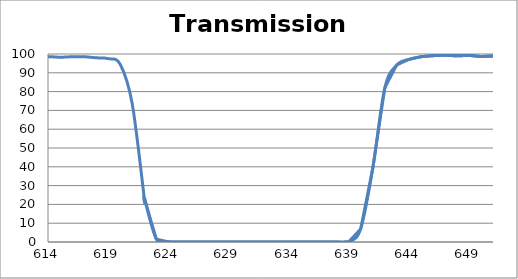
| Category | Transmission (%) |
|---|---|
| 2600.0 | 53.779 |
| 2599.0 | 53.903 |
| 2598.0 | 54.052 |
| 2597.0 | 54.214 |
| 2596.0 | 54.414 |
| 2595.0 | 54.621 |
| 2594.0 | 54.857 |
| 2593.0 | 55.113 |
| 2592.0 | 55.359 |
| 2591.0 | 55.598 |
| 2590.0 | 55.882 |
| 2589.0 | 56.105 |
| 2588.0 | 56.334 |
| 2587.0 | 56.587 |
| 2586.0 | 56.781 |
| 2585.0 | 56.951 |
| 2584.0 | 57.14 |
| 2583.0 | 57.288 |
| 2582.0 | 57.428 |
| 2581.0 | 57.559 |
| 2580.0 | 57.666 |
| 2579.0 | 57.759 |
| 2578.0 | 57.861 |
| 2577.0 | 57.938 |
| 2576.0 | 57.97 |
| 2575.0 | 58.003 |
| 2574.0 | 58.03 |
| 2573.0 | 58.017 |
| 2572.0 | 57.987 |
| 2571.0 | 57.946 |
| 2570.0 | 57.883 |
| 2569.0 | 57.814 |
| 2568.0 | 57.769 |
| 2567.0 | 57.751 |
| 2566.0 | 57.688 |
| 2565.0 | 57.665 |
| 2564.0 | 57.629 |
| 2563.0 | 57.592 |
| 2562.0 | 57.558 |
| 2561.0 | 57.552 |
| 2560.0 | 57.543 |
| 2559.0 | 57.553 |
| 2558.0 | 57.589 |
| 2557.0 | 57.664 |
| 2556.0 | 57.778 |
| 2555.0 | 57.915 |
| 2554.0 | 58.063 |
| 2553.0 | 58.225 |
| 2552.0 | 58.458 |
| 2551.0 | 58.707 |
| 2550.0 | 59.029 |
| 2549.0 | 59.419 |
| 2548.0 | 59.842 |
| 2547.0 | 60.257 |
| 2546.0 | 60.72 |
| 2545.0 | 61.197 |
| 2544.0 | 61.707 |
| 2543.0 | 62.208 |
| 2542.0 | 62.696 |
| 2541.0 | 63.156 |
| 2540.0 | 63.658 |
| 2539.0 | 64.196 |
| 2538.0 | 64.724 |
| 2537.0 | 65.247 |
| 2536.0 | 65.795 |
| 2535.0 | 66.284 |
| 2534.0 | 66.806 |
| 2533.0 | 67.324 |
| 2532.0 | 67.748 |
| 2531.0 | 68.104 |
| 2530.0 | 68.475 |
| 2529.0 | 68.784 |
| 2528.0 | 69.013 |
| 2527.0 | 69.186 |
| 2526.0 | 69.29 |
| 2525.0 | 69.328 |
| 2524.0 | 69.316 |
| 2523.0 | 69.221 |
| 2522.0 | 69.059 |
| 2521.0 | 68.856 |
| 2520.0 | 68.588 |
| 2519.0 | 68.261 |
| 2518.0 | 67.891 |
| 2517.0 | 67.444 |
| 2516.0 | 66.932 |
| 2515.0 | 66.382 |
| 2514.0 | 65.857 |
| 2513.0 | 65.319 |
| 2512.0 | 64.758 |
| 2511.0 | 64.233 |
| 2510.0 | 63.623 |
| 2509.0 | 63.084 |
| 2508.0 | 62.562 |
| 2507.0 | 62.037 |
| 2506.0 | 61.54 |
| 2505.0 | 61.094 |
| 2504.0 | 60.698 |
| 2503.0 | 60.313 |
| 2502.0 | 59.962 |
| 2501.0 | 59.698 |
| 2500.0 | 59.497 |
| 2499.0 | 59.322 |
| 2498.0 | 59.209 |
| 2497.0 | 59.177 |
| 2496.0 | 59.19 |
| 2495.0 | 59.253 |
| 2494.0 | 59.372 |
| 2493.0 | 59.544 |
| 2492.0 | 59.79 |
| 2491.0 | 60.092 |
| 2490.0 | 60.452 |
| 2489.0 | 60.864 |
| 2488.0 | 61.324 |
| 2487.0 | 61.822 |
| 2486.0 | 62.352 |
| 2485.0 | 62.927 |
| 2484.0 | 63.575 |
| 2483.0 | 64.228 |
| 2482.0 | 64.945 |
| 2481.0 | 65.644 |
| 2480.0 | 66.351 |
| 2479.0 | 67.07 |
| 2478.0 | 67.779 |
| 2477.0 | 68.444 |
| 2476.0 | 69.126 |
| 2475.0 | 69.756 |
| 2474.0 | 70.365 |
| 2473.0 | 70.929 |
| 2472.0 | 71.455 |
| 2471.0 | 71.878 |
| 2470.0 | 72.217 |
| 2469.0 | 72.469 |
| 2468.0 | 72.666 |
| 2467.0 | 72.79 |
| 2466.0 | 72.822 |
| 2465.0 | 72.741 |
| 2464.0 | 72.591 |
| 2463.0 | 72.411 |
| 2462.0 | 72.176 |
| 2461.0 | 71.874 |
| 2460.0 | 71.514 |
| 2459.0 | 71.107 |
| 2458.0 | 70.675 |
| 2457.0 | 70.243 |
| 2456.0 | 69.792 |
| 2455.0 | 69.34 |
| 2454.0 | 68.873 |
| 2453.0 | 68.418 |
| 2452.0 | 67.992 |
| 2451.0 | 67.603 |
| 2450.0 | 67.24 |
| 2449.0 | 66.889 |
| 2448.0 | 66.58 |
| 2447.0 | 66.326 |
| 2446.0 | 66.14 |
| 2445.0 | 66.019 |
| 2444.0 | 65.929 |
| 2443.0 | 65.893 |
| 2442.0 | 65.915 |
| 2441.0 | 66.005 |
| 2440.0 | 66.152 |
| 2439.0 | 66.37 |
| 2438.0 | 66.647 |
| 2437.0 | 66.967 |
| 2436.0 | 67.336 |
| 2435.0 | 67.747 |
| 2434.0 | 68.198 |
| 2433.0 | 68.706 |
| 2432.0 | 69.241 |
| 2431.0 | 69.799 |
| 2430.0 | 70.383 |
| 2429.0 | 70.961 |
| 2428.0 | 71.532 |
| 2427.0 | 72.08 |
| 2426.0 | 72.606 |
| 2425.0 | 73.115 |
| 2424.0 | 73.588 |
| 2423.0 | 73.996 |
| 2422.0 | 74.333 |
| 2421.0 | 74.624 |
| 2420.0 | 74.871 |
| 2419.0 | 75.024 |
| 2418.0 | 75.088 |
| 2417.0 | 75.087 |
| 2416.0 | 75.011 |
| 2415.0 | 74.825 |
| 2414.0 | 74.555 |
| 2413.0 | 74.255 |
| 2412.0 | 73.935 |
| 2411.0 | 73.557 |
| 2410.0 | 73.111 |
| 2409.0 | 72.607 |
| 2408.0 | 72.076 |
| 2407.0 | 71.545 |
| 2406.0 | 71.018 |
| 2405.0 | 70.482 |
| 2404.0 | 69.941 |
| 2403.0 | 69.397 |
| 2402.0 | 68.863 |
| 2401.0 | 68.35 |
| 2400.0 | 67.883 |
| 2399.0 | 67.492 |
| 2398.0 | 67.153 |
| 2397.0 | 66.83 |
| 2396.0 | 66.538 |
| 2395.0 | 66.303 |
| 2394.0 | 66.12 |
| 2393.0 | 66.016 |
| 2392.0 | 65.989 |
| 2391.0 | 65.994 |
| 2390.0 | 66.034 |
| 2389.0 | 66.123 |
| 2388.0 | 66.263 |
| 2387.0 | 66.424 |
| 2386.0 | 66.601 |
| 2385.0 | 66.823 |
| 2384.0 | 67.102 |
| 2383.0 | 67.369 |
| 2382.0 | 67.601 |
| 2381.0 | 67.823 |
| 2380.0 | 68.039 |
| 2379.0 | 68.228 |
| 2378.0 | 68.398 |
| 2377.0 | 68.518 |
| 2376.0 | 68.587 |
| 2375.0 | 68.603 |
| 2374.0 | 68.546 |
| 2373.0 | 68.41 |
| 2372.0 | 68.222 |
| 2371.0 | 67.959 |
| 2370.0 | 67.607 |
| 2369.0 | 67.178 |
| 2368.0 | 66.701 |
| 2367.0 | 66.154 |
| 2366.0 | 65.565 |
| 2365.0 | 64.919 |
| 2364.0 | 64.226 |
| 2363.0 | 63.482 |
| 2362.0 | 62.712 |
| 2361.0 | 61.966 |
| 2360.0 | 61.207 |
| 2359.0 | 60.414 |
| 2358.0 | 59.668 |
| 2357.0 | 58.926 |
| 2356.0 | 58.195 |
| 2355.0 | 57.501 |
| 2354.0 | 56.883 |
| 2353.0 | 56.35 |
| 2352.0 | 55.861 |
| 2351.0 | 55.414 |
| 2350.0 | 55.034 |
| 2349.0 | 54.702 |
| 2348.0 | 54.452 |
| 2347.0 | 54.303 |
| 2346.0 | 54.239 |
| 2345.0 | 54.245 |
| 2344.0 | 54.319 |
| 2343.0 | 54.458 |
| 2342.0 | 54.673 |
| 2341.0 | 54.961 |
| 2340.0 | 55.332 |
| 2339.0 | 55.827 |
| 2338.0 | 56.362 |
| 2337.0 | 56.941 |
| 2336.0 | 57.569 |
| 2335.0 | 58.253 |
| 2334.0 | 58.982 |
| 2333.0 | 59.748 |
| 2332.0 | 60.547 |
| 2331.0 | 61.399 |
| 2330.0 | 62.28 |
| 2329.0 | 63.113 |
| 2328.0 | 63.949 |
| 2327.0 | 64.811 |
| 2326.0 | 65.656 |
| 2325.0 | 66.45 |
| 2324.0 | 67.157 |
| 2323.0 | 67.799 |
| 2322.0 | 68.369 |
| 2321.0 | 68.88 |
| 2320.0 | 69.277 |
| 2319.0 | 69.567 |
| 2318.0 | 69.756 |
| 2317.0 | 69.831 |
| 2316.0 | 69.797 |
| 2315.0 | 69.637 |
| 2314.0 | 69.424 |
| 2313.0 | 69.111 |
| 2312.0 | 68.73 |
| 2311.0 | 68.252 |
| 2310.0 | 67.715 |
| 2309.0 | 67.132 |
| 2308.0 | 66.515 |
| 2307.0 | 65.929 |
| 2306.0 | 65.367 |
| 2305.0 | 64.755 |
| 2304.0 | 64.186 |
| 2303.0 | 63.603 |
| 2302.0 | 63.074 |
| 2301.0 | 62.592 |
| 2300.0 | 62.181 |
| 2299.0 | 61.85 |
| 2298.0 | 61.554 |
| 2297.0 | 61.29 |
| 2296.0 | 61.102 |
| 2295.0 | 60.965 |
| 2294.0 | 60.884 |
| 2293.0 | 60.881 |
| 2292.0 | 60.959 |
| 2291.0 | 61.083 |
| 2290.0 | 61.239 |
| 2289.0 | 61.431 |
| 2288.0 | 61.688 |
| 2287.0 | 61.998 |
| 2286.0 | 62.347 |
| 2285.0 | 62.746 |
| 2284.0 | 63.17 |
| 2283.0 | 63.639 |
| 2282.0 | 64.169 |
| 2281.0 | 64.668 |
| 2280.0 | 65.184 |
| 2279.0 | 65.735 |
| 2278.0 | 66.275 |
| 2277.0 | 66.809 |
| 2276.0 | 67.317 |
| 2275.0 | 67.803 |
| 2274.0 | 68.307 |
| 2273.0 | 68.812 |
| 2272.0 | 69.269 |
| 2271.0 | 69.731 |
| 2270.0 | 70.165 |
| 2269.0 | 70.517 |
| 2268.0 | 70.858 |
| 2267.0 | 71.193 |
| 2266.0 | 71.53 |
| 2265.0 | 71.815 |
| 2264.0 | 72.085 |
| 2263.0 | 72.376 |
| 2262.0 | 72.617 |
| 2261.0 | 72.848 |
| 2260.0 | 73.064 |
| 2259.0 | 73.327 |
| 2258.0 | 73.552 |
| 2257.0 | 73.778 |
| 2256.0 | 73.924 |
| 2255.0 | 74.103 |
| 2254.0 | 74.264 |
| 2253.0 | 74.41 |
| 2252.0 | 74.517 |
| 2251.0 | 74.613 |
| 2250.0 | 74.645 |
| 2249.0 | 74.637 |
| 2248.0 | 74.606 |
| 2247.0 | 74.519 |
| 2246.0 | 74.387 |
| 2245.0 | 74.145 |
| 2244.0 | 73.804 |
| 2243.0 | 73.396 |
| 2242.0 | 72.939 |
| 2241.0 | 72.384 |
| 2240.0 | 71.725 |
| 2239.0 | 71.041 |
| 2238.0 | 70.295 |
| 2237.0 | 69.408 |
| 2236.0 | 68.477 |
| 2235.0 | 67.501 |
| 2234.0 | 66.505 |
| 2233.0 | 65.515 |
| 2232.0 | 64.478 |
| 2231.0 | 63.483 |
| 2230.0 | 62.499 |
| 2229.0 | 61.499 |
| 2228.0 | 60.526 |
| 2227.0 | 59.609 |
| 2226.0 | 58.749 |
| 2225.0 | 57.929 |
| 2224.0 | 57.2 |
| 2223.0 | 56.515 |
| 2222.0 | 55.949 |
| 2221.0 | 55.476 |
| 2220.0 | 55.108 |
| 2219.0 | 54.839 |
| 2218.0 | 54.677 |
| 2217.0 | 54.577 |
| 2216.0 | 54.631 |
| 2215.0 | 54.776 |
| 2214.0 | 55.015 |
| 2213.0 | 55.384 |
| 2212.0 | 55.908 |
| 2211.0 | 56.572 |
| 2210.0 | 57.324 |
| 2209.0 | 58.242 |
| 2208.0 | 59.349 |
| 2207.0 | 60.506 |
| 2206.0 | 61.762 |
| 2205.0 | 63.123 |
| 2204.0 | 64.642 |
| 2203.0 | 66.157 |
| 2202.0 | 67.722 |
| 2201.0 | 69.388 |
| 2200.0 | 71.001 |
| 2199.0 | 72.46 |
| 2198.0 | 73.881 |
| 2197.0 | 75.276 |
| 2196.0 | 76.391 |
| 2195.0 | 77.373 |
| 2194.0 | 78.067 |
| 2193.0 | 78.631 |
| 2192.0 | 78.917 |
| 2191.0 | 79.018 |
| 2190.0 | 78.958 |
| 2189.0 | 78.686 |
| 2188.0 | 78.246 |
| 2187.0 | 77.692 |
| 2186.0 | 77.04 |
| 2185.0 | 76.318 |
| 2184.0 | 75.559 |
| 2183.0 | 74.769 |
| 2182.0 | 73.998 |
| 2181.0 | 73.301 |
| 2180.0 | 72.62 |
| 2179.0 | 71.978 |
| 2178.0 | 71.479 |
| 2177.0 | 71.03 |
| 2176.0 | 70.688 |
| 2175.0 | 70.489 |
| 2174.0 | 70.367 |
| 2173.0 | 70.364 |
| 2172.0 | 70.455 |
| 2171.0 | 70.669 |
| 2170.0 | 71.026 |
| 2169.0 | 71.475 |
| 2168.0 | 72.034 |
| 2167.0 | 72.694 |
| 2166.0 | 73.429 |
| 2165.0 | 74.294 |
| 2164.0 | 75.242 |
| 2163.0 | 76.199 |
| 2162.0 | 77.184 |
| 2161.0 | 78.183 |
| 2160.0 | 79.237 |
| 2159.0 | 80.264 |
| 2158.0 | 81.277 |
| 2157.0 | 82.141 |
| 2156.0 | 82.898 |
| 2155.0 | 83.564 |
| 2154.0 | 84.113 |
| 2153.0 | 84.44 |
| 2152.0 | 84.646 |
| 2151.0 | 84.686 |
| 2150.0 | 84.583 |
| 2149.0 | 84.316 |
| 2148.0 | 83.905 |
| 2147.0 | 83.347 |
| 2146.0 | 82.72 |
| 2145.0 | 82.006 |
| 2144.0 | 81.266 |
| 2143.0 | 80.437 |
| 2142.0 | 79.6 |
| 2141.0 | 78.777 |
| 2140.0 | 78.029 |
| 2139.0 | 77.325 |
| 2138.0 | 76.695 |
| 2137.0 | 76.1 |
| 2136.0 | 75.625 |
| 2135.0 | 75.246 |
| 2134.0 | 74.94 |
| 2133.0 | 74.735 |
| 2132.0 | 74.674 |
| 2131.0 | 74.696 |
| 2130.0 | 74.821 |
| 2129.0 | 75.016 |
| 2128.0 | 75.284 |
| 2127.0 | 75.669 |
| 2126.0 | 76.111 |
| 2125.0 | 76.645 |
| 2124.0 | 77.205 |
| 2123.0 | 77.823 |
| 2122.0 | 78.471 |
| 2121.0 | 79.088 |
| 2120.0 | 79.701 |
| 2119.0 | 80.296 |
| 2118.0 | 80.836 |
| 2117.0 | 81.263 |
| 2116.0 | 81.584 |
| 2115.0 | 81.827 |
| 2114.0 | 81.989 |
| 2113.0 | 82.036 |
| 2112.0 | 81.945 |
| 2111.0 | 81.721 |
| 2110.0 | 81.41 |
| 2109.0 | 80.978 |
| 2108.0 | 80.457 |
| 2107.0 | 79.862 |
| 2106.0 | 79.262 |
| 2105.0 | 78.611 |
| 2104.0 | 77.974 |
| 2103.0 | 77.278 |
| 2102.0 | 76.615 |
| 2101.0 | 76.005 |
| 2100.0 | 75.472 |
| 2099.0 | 75.01 |
| 2098.0 | 74.594 |
| 2097.0 | 74.224 |
| 2096.0 | 73.982 |
| 2095.0 | 73.811 |
| 2094.0 | 73.737 |
| 2093.0 | 73.761 |
| 2092.0 | 73.868 |
| 2091.0 | 74.059 |
| 2090.0 | 74.299 |
| 2089.0 | 74.636 |
| 2088.0 | 75.049 |
| 2087.0 | 75.54 |
| 2086.0 | 76.104 |
| 2085.0 | 76.736 |
| 2084.0 | 77.332 |
| 2083.0 | 77.981 |
| 2082.0 | 78.618 |
| 2081.0 | 79.301 |
| 2080.0 | 79.981 |
| 2079.0 | 80.589 |
| 2078.0 | 81.157 |
| 2077.0 | 81.683 |
| 2076.0 | 82.155 |
| 2075.0 | 82.583 |
| 2074.0 | 82.919 |
| 2073.0 | 83.195 |
| 2072.0 | 83.401 |
| 2071.0 | 83.512 |
| 2070.0 | 83.588 |
| 2069.0 | 83.634 |
| 2068.0 | 83.627 |
| 2067.0 | 83.603 |
| 2066.0 | 83.567 |
| 2065.0 | 83.517 |
| 2064.0 | 83.498 |
| 2063.0 | 83.466 |
| 2062.0 | 83.451 |
| 2061.0 | 83.492 |
| 2060.0 | 83.58 |
| 2059.0 | 83.693 |
| 2058.0 | 83.815 |
| 2057.0 | 83.979 |
| 2056.0 | 84.188 |
| 2055.0 | 84.432 |
| 2054.0 | 84.738 |
| 2053.0 | 85.067 |
| 2052.0 | 85.36 |
| 2051.0 | 85.656 |
| 2050.0 | 85.947 |
| 2049.0 | 86.264 |
| 2048.0 | 86.564 |
| 2047.0 | 86.819 |
| 2046.0 | 87.054 |
| 2045.0 | 87.23 |
| 2044.0 | 87.353 |
| 2043.0 | 87.445 |
| 2042.0 | 87.489 |
| 2041.0 | 87.48 |
| 2040.0 | 87.407 |
| 2039.0 | 87.268 |
| 2038.0 | 87.104 |
| 2037.0 | 86.917 |
| 2036.0 | 86.701 |
| 2035.0 | 86.491 |
| 2034.0 | 86.285 |
| 2033.0 | 86.064 |
| 2032.0 | 85.851 |
| 2031.0 | 85.689 |
| 2030.0 | 85.571 |
| 2029.0 | 85.478 |
| 2028.0 | 85.417 |
| 2027.0 | 85.403 |
| 2026.0 | 85.433 |
| 2025.0 | 85.473 |
| 2024.0 | 85.559 |
| 2023.0 | 85.672 |
| 2022.0 | 85.783 |
| 2021.0 | 85.928 |
| 2020.0 | 86.052 |
| 2019.0 | 86.126 |
| 2018.0 | 86.186 |
| 2017.0 | 86.201 |
| 2016.0 | 86.176 |
| 2015.0 | 86.112 |
| 2014.0 | 85.997 |
| 2013.0 | 85.793 |
| 2012.0 | 85.487 |
| 2011.0 | 85.153 |
| 2010.0 | 84.772 |
| 2009.0 | 84.323 |
| 2008.0 | 83.812 |
| 2007.0 | 83.263 |
| 2006.0 | 82.674 |
| 2005.0 | 82.103 |
| 2004.0 | 81.55 |
| 2003.0 | 81.001 |
| 2002.0 | 80.489 |
| 2001.0 | 80.027 |
| 2000.0 | 79.619 |
| 1999.0 | 79.296 |
| 1998.0 | 79.064 |
| 1997.0 | 78.931 |
| 1996.0 | 78.887 |
| 1995.0 | 78.944 |
| 1994.0 | 79.126 |
| 1993.0 | 79.405 |
| 1992.0 | 79.815 |
| 1991.0 | 80.286 |
| 1990.0 | 80.845 |
| 1989.0 | 81.488 |
| 1988.0 | 82.16 |
| 1987.0 | 82.855 |
| 1986.0 | 83.578 |
| 1985.0 | 84.297 |
| 1984.0 | 84.993 |
| 1983.0 | 85.616 |
| 1982.0 | 86.152 |
| 1981.0 | 86.591 |
| 1980.0 | 86.906 |
| 1979.0 | 87.083 |
| 1978.0 | 87.117 |
| 1977.0 | 87.028 |
| 1976.0 | 86.833 |
| 1975.0 | 86.52 |
| 1974.0 | 86.097 |
| 1973.0 | 85.595 |
| 1972.0 | 84.995 |
| 1971.0 | 84.372 |
| 1970.0 | 83.749 |
| 1969.0 | 83.116 |
| 1968.0 | 82.533 |
| 1967.0 | 82.001 |
| 1966.0 | 81.492 |
| 1965.0 | 81.097 |
| 1964.0 | 80.817 |
| 1963.0 | 80.649 |
| 1962.0 | 80.576 |
| 1961.0 | 80.664 |
| 1960.0 | 80.888 |
| 1959.0 | 81.234 |
| 1958.0 | 81.72 |
| 1957.0 | 82.355 |
| 1956.0 | 83.063 |
| 1955.0 | 83.816 |
| 1954.0 | 84.701 |
| 1953.0 | 85.619 |
| 1952.0 | 86.564 |
| 1951.0 | 87.553 |
| 1950.0 | 88.444 |
| 1949.0 | 89.251 |
| 1948.0 | 89.987 |
| 1947.0 | 90.641 |
| 1946.0 | 91.124 |
| 1945.0 | 91.468 |
| 1944.0 | 91.628 |
| 1943.0 | 91.682 |
| 1942.0 | 91.572 |
| 1941.0 | 91.34 |
| 1940.0 | 90.988 |
| 1939.0 | 90.579 |
| 1938.0 | 90.071 |
| 1937.0 | 89.569 |
| 1936.0 | 89.102 |
| 1935.0 | 88.648 |
| 1934.0 | 88.228 |
| 1933.0 | 87.855 |
| 1932.0 | 87.554 |
| 1931.0 | 87.373 |
| 1930.0 | 87.31 |
| 1929.0 | 87.302 |
| 1928.0 | 87.367 |
| 1927.0 | 87.51 |
| 1926.0 | 87.77 |
| 1925.0 | 88.099 |
| 1924.0 | 88.459 |
| 1923.0 | 88.848 |
| 1922.0 | 89.259 |
| 1921.0 | 89.643 |
| 1920.0 | 89.938 |
| 1919.0 | 90.117 |
| 1918.0 | 90.217 |
| 1917.0 | 90.209 |
| 1916.0 | 90.073 |
| 1915.0 | 89.789 |
| 1914.0 | 89.312 |
| 1913.0 | 88.589 |
| 1912.0 | 87.732 |
| 1911.0 | 86.884 |
| 1910.0 | 85.986 |
| 1909.0 | 85.156 |
| 1908.0 | 84.279 |
| 1907.0 | 83.405 |
| 1906.0 | 82.467 |
| 1905.0 | 81.497 |
| 1904.0 | 80.669 |
| 1903.0 | 80.093 |
| 1902.0 | 79.677 |
| 1901.0 | 79.421 |
| 1900.0 | 79.3 |
| 1899.0 | 79.328 |
| 1898.0 | 79.503 |
| 1897.0 | 79.82 |
| 1896.0 | 80.243 |
| 1895.0 | 80.806 |
| 1894.0 | 81.501 |
| 1893.0 | 82.253 |
| 1892.0 | 83.112 |
| 1891.0 | 83.949 |
| 1890.0 | 84.799 |
| 1889.0 | 85.591 |
| 1888.0 | 86.355 |
| 1887.0 | 86.971 |
| 1886.0 | 87.44 |
| 1885.0 | 87.762 |
| 1884.0 | 87.914 |
| 1883.0 | 87.857 |
| 1882.0 | 87.64 |
| 1881.0 | 87.259 |
| 1880.0 | 86.702 |
| 1879.0 | 86.108 |
| 1878.0 | 85.391 |
| 1877.0 | 84.564 |
| 1876.0 | 83.747 |
| 1875.0 | 82.939 |
| 1874.0 | 82.237 |
| 1873.0 | 81.549 |
| 1872.0 | 80.979 |
| 1871.0 | 80.526 |
| 1870.0 | 80.291 |
| 1869.0 | 80.254 |
| 1868.0 | 80.283 |
| 1867.0 | 80.565 |
| 1866.0 | 80.881 |
| 1865.0 | 81.414 |
| 1864.0 | 81.999 |
| 1863.0 | 82.733 |
| 1862.0 | 83.355 |
| 1861.0 | 84.127 |
| 1860.0 | 84.863 |
| 1859.0 | 85.515 |
| 1858.0 | 86.146 |
| 1857.0 | 86.588 |
| 1856.0 | 86.898 |
| 1855.0 | 86.954 |
| 1854.0 | 86.955 |
| 1853.0 | 86.754 |
| 1852.0 | 86.358 |
| 1851.0 | 85.968 |
| 1850.0 | 85.507 |
| 1849.0 | 84.899 |
| 1848.0 | 84.106 |
| 1847.0 | 83.223 |
| 1846.0 | 82.397 |
| 1845.0 | 81.772 |
| 1844.0 | 81.338 |
| 1843.0 | 81.088 |
| 1842.0 | 80.871 |
| 1841.0 | 80.782 |
| 1840.0 | 80.868 |
| 1839.0 | 81.075 |
| 1838.0 | 81.443 |
| 1837.0 | 82.122 |
| 1836.0 | 83.037 |
| 1835.0 | 84.084 |
| 1834.0 | 85.111 |
| 1833.0 | 86.201 |
| 1832.0 | 87.337 |
| 1831.0 | 88.553 |
| 1830.0 | 89.779 |
| 1829.0 | 90.912 |
| 1828.0 | 91.82 |
| 1827.0 | 92.532 |
| 1826.0 | 93.119 |
| 1825.0 | 93.494 |
| 1824.0 | 93.585 |
| 1823.0 | 93.593 |
| 1822.0 | 93.407 |
| 1821.0 | 92.888 |
| 1820.0 | 92.281 |
| 1819.0 | 91.671 |
| 1818.0 | 91.079 |
| 1817.0 | 90.533 |
| 1816.0 | 89.983 |
| 1815.0 | 89.512 |
| 1814.0 | 89.119 |
| 1813.0 | 88.892 |
| 1812.0 | 88.792 |
| 1811.0 | 88.86 |
| 1810.0 | 89.033 |
| 1809.0 | 89.307 |
| 1808.0 | 89.729 |
| 1807.0 | 90.185 |
| 1806.0 | 90.727 |
| 1805.0 | 91.267 |
| 1804.0 | 91.804 |
| 1803.0 | 92.29 |
| 1802.0 | 92.642 |
| 1801.0 | 92.869 |
| 1800.0 | 92.965 |
| 1799.0 | 92.884 |
| 1798.0 | 92.619 |
| 1797.0 | 92.119 |
| 1796.0 | 91.492 |
| 1795.0 | 90.713 |
| 1794.0 | 89.835 |
| 1793.0 | 88.966 |
| 1792.0 | 88.027 |
| 1791.0 | 87.183 |
| 1790.0 | 86.311 |
| 1789.0 | 85.628 |
| 1788.0 | 85.038 |
| 1787.0 | 84.588 |
| 1786.0 | 84.311 |
| 1785.0 | 84.17 |
| 1784.0 | 84.16 |
| 1783.0 | 84.294 |
| 1782.0 | 84.514 |
| 1781.0 | 84.825 |
| 1780.0 | 85.193 |
| 1779.0 | 85.473 |
| 1778.0 | 85.828 |
| 1777.0 | 86.12 |
| 1776.0 | 86.237 |
| 1775.0 | 86.273 |
| 1774.0 | 86.183 |
| 1773.0 | 85.933 |
| 1772.0 | 85.505 |
| 1771.0 | 84.983 |
| 1770.0 | 84.318 |
| 1769.0 | 83.571 |
| 1768.0 | 82.779 |
| 1767.0 | 82.006 |
| 1766.0 | 81.24 |
| 1765.0 | 80.564 |
| 1764.0 | 79.971 |
| 1763.0 | 79.527 |
| 1762.0 | 79.249 |
| 1761.0 | 79.131 |
| 1760.0 | 79.247 |
| 1759.0 | 79.528 |
| 1758.0 | 79.992 |
| 1757.0 | 80.605 |
| 1756.0 | 81.336 |
| 1755.0 | 82.173 |
| 1754.0 | 83.066 |
| 1753.0 | 83.952 |
| 1752.0 | 84.748 |
| 1751.0 | 85.361 |
| 1750.0 | 85.79 |
| 1749.0 | 85.971 |
| 1748.0 | 85.881 |
| 1747.0 | 85.533 |
| 1746.0 | 84.907 |
| 1745.0 | 84.05 |
| 1744.0 | 82.952 |
| 1743.0 | 81.773 |
| 1742.0 | 80.506 |
| 1741.0 | 79.259 |
| 1740.0 | 78.147 |
| 1739.0 | 77.13 |
| 1738.0 | 76.251 |
| 1737.0 | 75.6 |
| 1736.0 | 75.17 |
| 1735.0 | 74.986 |
| 1734.0 | 75.068 |
| 1733.0 | 75.441 |
| 1732.0 | 76.066 |
| 1731.0 | 76.898 |
| 1730.0 | 78.005 |
| 1729.0 | 79.315 |
| 1728.0 | 80.779 |
| 1727.0 | 82.363 |
| 1726.0 | 84.008 |
| 1725.0 | 85.54 |
| 1724.0 | 86.972 |
| 1723.0 | 88.247 |
| 1722.0 | 89.265 |
| 1721.0 | 89.932 |
| 1720.0 | 90.304 |
| 1719.0 | 90.324 |
| 1718.0 | 90.002 |
| 1717.0 | 89.423 |
| 1716.0 | 88.642 |
| 1715.0 | 87.741 |
| 1714.0 | 86.819 |
| 1713.0 | 85.92 |
| 1712.0 | 85.104 |
| 1711.0 | 84.488 |
| 1710.0 | 84.05 |
| 1709.0 | 83.854 |
| 1708.0 | 83.89 |
| 1707.0 | 84.123 |
| 1706.0 | 84.564 |
| 1705.0 | 85.176 |
| 1704.0 | 85.916 |
| 1703.0 | 86.675 |
| 1702.0 | 87.434 |
| 1701.0 | 88.153 |
| 1700.0 | 88.732 |
| 1699.0 | 89.079 |
| 1698.0 | 89.196 |
| 1697.0 | 89.03 |
| 1696.0 | 88.591 |
| 1695.0 | 87.953 |
| 1694.0 | 87.147 |
| 1693.0 | 86.146 |
| 1692.0 | 85.051 |
| 1691.0 | 83.937 |
| 1690.0 | 82.831 |
| 1689.0 | 81.804 |
| 1688.0 | 80.882 |
| 1687.0 | 80.127 |
| 1686.0 | 79.557 |
| 1685.0 | 79.178 |
| 1684.0 | 78.943 |
| 1683.0 | 78.866 |
| 1682.0 | 78.898 |
| 1681.0 | 79.01 |
| 1680.0 | 79.13 |
| 1679.0 | 79.2 |
| 1678.0 | 79.142 |
| 1677.0 | 78.919 |
| 1676.0 | 78.485 |
| 1675.0 | 77.8 |
| 1674.0 | 76.884 |
| 1673.0 | 75.736 |
| 1672.0 | 74.396 |
| 1671.0 | 72.954 |
| 1670.0 | 71.451 |
| 1669.0 | 69.92 |
| 1668.0 | 68.513 |
| 1667.0 | 67.322 |
| 1666.0 | 66.276 |
| 1665.0 | 65.488 |
| 1664.0 | 64.933 |
| 1663.0 | 64.628 |
| 1662.0 | 64.589 |
| 1661.0 | 64.795 |
| 1660.0 | 65.183 |
| 1659.0 | 65.746 |
| 1658.0 | 66.416 |
| 1657.0 | 67.065 |
| 1656.0 | 67.662 |
| 1655.0 | 68.1 |
| 1654.0 | 68.317 |
| 1653.0 | 68.241 |
| 1652.0 | 67.825 |
| 1651.0 | 67.04 |
| 1650.0 | 65.903 |
| 1649.0 | 64.471 |
| 1648.0 | 62.857 |
| 1647.0 | 61.073 |
| 1646.0 | 59.188 |
| 1645.0 | 57.372 |
| 1644.0 | 55.656 |
| 1643.0 | 54.103 |
| 1642.0 | 52.809 |
| 1641.0 | 51.805 |
| 1640.0 | 51.074 |
| 1639.0 | 50.658 |
| 1638.0 | 50.58 |
| 1637.0 | 50.855 |
| 1636.0 | 51.483 |
| 1635.0 | 52.397 |
| 1634.0 | 53.55 |
| 1633.0 | 54.965 |
| 1632.0 | 56.533 |
| 1631.0 | 58.183 |
| 1630.0 | 59.867 |
| 1629.0 | 61.421 |
| 1628.0 | 62.738 |
| 1627.0 | 63.734 |
| 1626.0 | 64.322 |
| 1625.0 | 64.493 |
| 1624.0 | 64.265 |
| 1623.0 | 63.672 |
| 1622.0 | 62.822 |
| 1621.0 | 61.802 |
| 1620.0 | 60.749 |
| 1619.0 | 59.737 |
| 1618.0 | 58.839 |
| 1617.0 | 58.154 |
| 1616.0 | 57.704 |
| 1615.0 | 57.504 |
| 1614.0 | 57.571 |
| 1613.0 | 57.942 |
| 1612.0 | 58.626 |
| 1611.0 | 59.544 |
| 1610.0 | 60.662 |
| 1609.0 | 61.933 |
| 1608.0 | 63.262 |
| 1607.0 | 64.633 |
| 1606.0 | 65.934 |
| 1605.0 | 67.095 |
| 1604.0 | 68.008 |
| 1603.0 | 68.621 |
| 1602.0 | 68.927 |
| 1601.0 | 68.898 |
| 1600.0 | 68.614 |
| 1599.0 | 68.112 |
| 1598.0 | 67.488 |
| 1597.0 | 66.852 |
| 1596.0 | 66.282 |
| 1595.0 | 65.833 |
| 1594.0 | 65.587 |
| 1593.0 | 65.597 |
| 1592.0 | 65.833 |
| 1591.0 | 66.334 |
| 1590.0 | 67.072 |
| 1589.0 | 67.994 |
| 1588.0 | 69.008 |
| 1587.0 | 70.077 |
| 1586.0 | 71.052 |
| 1585.0 | 71.934 |
| 1584.0 | 72.522 |
| 1583.0 | 72.817 |
| 1582.0 | 72.829 |
| 1581.0 | 72.503 |
| 1580.0 | 71.935 |
| 1579.0 | 71.152 |
| 1578.0 | 70.258 |
| 1577.0 | 69.309 |
| 1576.0 | 68.477 |
| 1575.0 | 67.754 |
| 1574.0 | 67.174 |
| 1573.0 | 66.825 |
| 1572.0 | 66.741 |
| 1571.0 | 66.906 |
| 1570.0 | 67.309 |
| 1569.0 | 67.875 |
| 1568.0 | 68.551 |
| 1567.0 | 69.301 |
| 1566.0 | 69.999 |
| 1565.0 | 70.601 |
| 1564.0 | 70.975 |
| 1563.0 | 70.988 |
| 1562.0 | 70.591 |
| 1561.0 | 69.801 |
| 1560.0 | 68.687 |
| 1559.0 | 67.349 |
| 1558.0 | 65.828 |
| 1557.0 | 64.2 |
| 1556.0 | 62.614 |
| 1555.0 | 61.176 |
| 1554.0 | 59.964 |
| 1553.0 | 59.045 |
| 1552.0 | 58.434 |
| 1551.0 | 58.133 |
| 1550.0 | 58.162 |
| 1549.0 | 58.485 |
| 1548.0 | 59.068 |
| 1547.0 | 59.867 |
| 1546.0 | 60.795 |
| 1545.0 | 61.876 |
| 1544.0 | 62.826 |
| 1543.0 | 63.615 |
| 1542.0 | 64.191 |
| 1541.0 | 64.473 |
| 1540.0 | 64.436 |
| 1539.0 | 64.082 |
| 1538.0 | 63.47 |
| 1537.0 | 62.635 |
| 1536.0 | 61.65 |
| 1535.0 | 60.649 |
| 1534.0 | 59.698 |
| 1533.0 | 58.822 |
| 1532.0 | 58.177 |
| 1531.0 | 57.71 |
| 1530.0 | 57.461 |
| 1529.0 | 57.408 |
| 1528.0 | 57.597 |
| 1527.0 | 58.032 |
| 1526.0 | 58.648 |
| 1525.0 | 59.453 |
| 1524.0 | 60.35 |
| 1523.0 | 61.299 |
| 1522.0 | 62.294 |
| 1521.0 | 63.152 |
| 1520.0 | 63.873 |
| 1519.0 | 64.448 |
| 1518.0 | 64.873 |
| 1517.0 | 65.132 |
| 1516.0 | 65.243 |
| 1515.0 | 65.231 |
| 1514.0 | 65.168 |
| 1513.0 | 65.042 |
| 1512.0 | 64.902 |
| 1511.0 | 64.78 |
| 1510.0 | 64.683 |
| 1509.0 | 64.623 |
| 1508.0 | 64.566 |
| 1507.0 | 64.515 |
| 1506.0 | 64.449 |
| 1505.0 | 64.345 |
| 1504.0 | 64.163 |
| 1503.0 | 63.902 |
| 1502.0 | 63.57 |
| 1501.0 | 63.196 |
| 1500.0 | 62.845 |
| 1499.0 | 62.437 |
| 1498.0 | 62.08 |
| 1497.0 | 61.746 |
| 1496.0 | 61.49 |
| 1495.0 | 61.319 |
| 1494.0 | 61.257 |
| 1493.0 | 61.247 |
| 1492.0 | 61.309 |
| 1491.0 | 61.396 |
| 1490.0 | 61.487 |
| 1489.0 | 61.514 |
| 1488.0 | 61.399 |
| 1487.0 | 61.159 |
| 1486.0 | 60.815 |
| 1485.0 | 60.272 |
| 1484.0 | 59.574 |
| 1483.0 | 58.754 |
| 1482.0 | 57.875 |
| 1481.0 | 56.981 |
| 1480.0 | 56.176 |
| 1479.0 | 55.419 |
| 1478.0 | 54.839 |
| 1477.0 | 54.418 |
| 1476.0 | 54.193 |
| 1475.0 | 54.143 |
| 1474.0 | 54.272 |
| 1473.0 | 54.594 |
| 1472.0 | 54.99 |
| 1471.0 | 55.454 |
| 1470.0 | 55.904 |
| 1469.0 | 56.269 |
| 1468.0 | 56.465 |
| 1467.0 | 56.528 |
| 1466.0 | 56.424 |
| 1465.0 | 56.128 |
| 1464.0 | 55.711 |
| 1463.0 | 55.187 |
| 1462.0 | 54.691 |
| 1461.0 | 54.121 |
| 1460.0 | 53.661 |
| 1459.0 | 53.291 |
| 1458.0 | 53.084 |
| 1457.0 | 53.033 |
| 1456.0 | 53.179 |
| 1455.0 | 53.428 |
| 1454.0 | 53.779 |
| 1453.0 | 54.246 |
| 1452.0 | 54.721 |
| 1451.0 | 55.218 |
| 1450.0 | 55.632 |
| 1449.0 | 55.946 |
| 1448.0 | 56.12 |
| 1447.0 | 56.217 |
| 1446.0 | 56.237 |
| 1445.0 | 56.056 |
| 1444.0 | 55.75 |
| 1443.0 | 55.472 |
| 1442.0 | 55.193 |
| 1441.0 | 54.966 |
| 1440.0 | 54.799 |
| 1439.0 | 54.721 |
| 1438.0 | 54.679 |
| 1437.0 | 54.664 |
| 1436.0 | 54.622 |
| 1435.0 | 54.618 |
| 1434.0 | 54.573 |
| 1433.0 | 54.431 |
| 1432.0 | 54.238 |
| 1431.0 | 53.951 |
| 1430.0 | 53.609 |
| 1429.0 | 53.246 |
| 1428.0 | 52.912 |
| 1427.0 | 52.604 |
| 1426.0 | 52.389 |
| 1425.0 | 52.308 |
| 1424.0 | 52.258 |
| 1423.0 | 52.288 |
| 1422.0 | 52.307 |
| 1421.0 | 52.348 |
| 1420.0 | 52.41 |
| 1419.0 | 52.372 |
| 1418.0 | 52.15 |
| 1417.0 | 51.748 |
| 1416.0 | 51.213 |
| 1415.0 | 50.582 |
| 1414.0 | 49.806 |
| 1413.0 | 48.816 |
| 1412.0 | 47.85 |
| 1411.0 | 47.049 |
| 1410.0 | 46.472 |
| 1409.0 | 45.983 |
| 1408.0 | 45.539 |
| 1407.0 | 45.287 |
| 1406.0 | 45.233 |
| 1405.0 | 45.365 |
| 1404.0 | 45.612 |
| 1403.0 | 45.87 |
| 1402.0 | 46.122 |
| 1401.0 | 46.437 |
| 1400.0 | 46.508 |
| 1399.0 | 46.111 |
| 1398.0 | 45.493 |
| 1397.0 | 45.007 |
| 1396.0 | 44.501 |
| 1395.0 | 43.638 |
| 1394.0 | 42.573 |
| 1393.0 | 41.74 |
| 1392.0 | 41.18 |
| 1391.0 | 40.75 |
| 1390.0 | 40.543 |
| 1389.0 | 40.623 |
| 1388.0 | 40.852 |
| 1387.0 | 41.16 |
| 1386.0 | 41.476 |
| 1385.0 | 41.929 |
| 1384.0 | 42.428 |
| 1383.0 | 42.922 |
| 1382.0 | 43.204 |
| 1381.0 | 43.261 |
| 1380.0 | 43.296 |
| 1379.0 | 43.309 |
| 1378.0 | 43.384 |
| 1377.0 | 43.491 |
| 1376.0 | 43.58 |
| 1375.0 | 43.701 |
| 1374.0 | 43.848 |
| 1373.0 | 44.073 |
| 1372.0 | 44.415 |
| 1371.0 | 44.792 |
| 1370.0 | 45.175 |
| 1369.0 | 45.514 |
| 1368.0 | 45.898 |
| 1367.0 | 46.26 |
| 1366.0 | 46.482 |
| 1365.0 | 46.663 |
| 1364.0 | 46.837 |
| 1363.0 | 46.935 |
| 1362.0 | 47.02 |
| 1361.0 | 47.075 |
| 1360.0 | 47.028 |
| 1359.0 | 46.96 |
| 1358.0 | 46.954 |
| 1357.0 | 46.944 |
| 1356.0 | 46.803 |
| 1355.0 | 46.523 |
| 1354.0 | 45.926 |
| 1353.0 | 45.243 |
| 1352.0 | 44.443 |
| 1351.0 | 43.719 |
| 1350.0 | 43.013 |
| 1349.0 | 42.404 |
| 1348.0 | 41.966 |
| 1347.0 | 41.696 |
| 1346.0 | 41.652 |
| 1345.0 | 41.881 |
| 1344.0 | 42.357 |
| 1343.0 | 42.93 |
| 1342.0 | 43.484 |
| 1341.0 | 43.946 |
| 1340.0 | 44.201 |
| 1339.0 | 44.134 |
| 1338.0 | 43.68 |
| 1337.0 | 42.829 |
| 1336.0 | 41.698 |
| 1335.0 | 40.416 |
| 1334.0 | 39.048 |
| 1333.0 | 37.725 |
| 1332.0 | 36.608 |
| 1331.0 | 35.738 |
| 1330.0 | 35.226 |
| 1329.0 | 35.008 |
| 1328.0 | 35.124 |
| 1327.0 | 35.557 |
| 1326.0 | 36.247 |
| 1325.0 | 37.15 |
| 1324.0 | 38.142 |
| 1323.0 | 39.107 |
| 1322.0 | 39.949 |
| 1321.0 | 40.551 |
| 1320.0 | 40.85 |
| 1319.0 | 40.867 |
| 1318.0 | 40.67 |
| 1317.0 | 40.359 |
| 1316.0 | 40.05 |
| 1315.0 | 39.849 |
| 1314.0 | 39.841 |
| 1313.0 | 40.056 |
| 1312.0 | 40.465 |
| 1311.0 | 41.044 |
| 1310.0 | 41.723 |
| 1309.0 | 42.44 |
| 1308.0 | 43.09 |
| 1307.0 | 43.602 |
| 1306.0 | 43.924 |
| 1305.0 | 44.059 |
| 1304.0 | 44.011 |
| 1303.0 | 43.883 |
| 1302.0 | 43.709 |
| 1301.0 | 43.57 |
| 1300.0 | 43.521 |
| 1299.0 | 43.523 |
| 1298.0 | 43.541 |
| 1297.0 | 43.524 |
| 1296.0 | 43.404 |
| 1295.0 | 43.125 |
| 1294.0 | 42.622 |
| 1293.0 | 41.873 |
| 1292.0 | 40.935 |
| 1291.0 | 39.842 |
| 1290.0 | 38.699 |
| 1289.0 | 37.607 |
| 1288.0 | 36.632 |
| 1287.0 | 35.803 |
| 1286.0 | 35.165 |
| 1285.0 | 34.699 |
| 1284.0 | 34.388 |
| 1283.0 | 34.186 |
| 1282.0 | 34.03 |
| 1281.0 | 33.883 |
| 1280.0 | 33.743 |
| 1279.0 | 33.555 |
| 1278.0 | 33.32 |
| 1277.0 | 33.084 |
| 1276.0 | 32.878 |
| 1275.0 | 32.746 |
| 1274.0 | 32.717 |
| 1273.0 | 32.782 |
| 1272.0 | 32.917 |
| 1271.0 | 33.078 |
| 1270.0 | 33.178 |
| 1269.0 | 33.131 |
| 1268.0 | 32.878 |
| 1267.0 | 32.407 |
| 1266.0 | 31.713 |
| 1265.0 | 30.908 |
| 1264.0 | 30.118 |
| 1263.0 | 29.448 |
| 1262.0 | 28.978 |
| 1261.0 | 28.746 |
| 1260.0 | 28.862 |
| 1259.0 | 29.332 |
| 1258.0 | 30.167 |
| 1257.0 | 31.282 |
| 1256.0 | 32.543 |
| 1255.0 | 33.838 |
| 1254.0 | 34.995 |
| 1253.0 | 35.798 |
| 1252.0 | 36.129 |
| 1251.0 | 36.007 |
| 1250.0 | 35.52 |
| 1249.0 | 34.855 |
| 1248.0 | 34.193 |
| 1247.0 | 33.728 |
| 1246.0 | 33.61 |
| 1245.0 | 33.911 |
| 1244.0 | 34.646 |
| 1243.0 | 35.817 |
| 1242.0 | 37.333 |
| 1241.0 | 38.924 |
| 1240.0 | 40.402 |
| 1239.0 | 41.508 |
| 1238.0 | 42.06 |
| 1237.0 | 42.077 |
| 1236.0 | 41.709 |
| 1235.0 | 41.186 |
| 1234.0 | 40.728 |
| 1233.0 | 40.517 |
| 1232.0 | 40.633 |
| 1231.0 | 41.095 |
| 1230.0 | 41.833 |
| 1229.0 | 42.616 |
| 1228.0 | 43.203 |
| 1227.0 | 43.409 |
| 1226.0 | 43.107 |
| 1225.0 | 42.321 |
| 1224.0 | 41.225 |
| 1223.0 | 40.053 |
| 1222.0 | 39.041 |
| 1221.0 | 38.4 |
| 1220.0 | 38.168 |
| 1219.0 | 38.338 |
| 1218.0 | 38.895 |
| 1217.0 | 39.688 |
| 1216.0 | 40.454 |
| 1215.0 | 40.937 |
| 1214.0 | 40.93 |
| 1213.0 | 40.35 |
| 1212.0 | 39.24 |
| 1211.0 | 37.813 |
| 1210.0 | 36.34 |
| 1209.0 | 35.058 |
| 1208.0 | 34.115 |
| 1207.0 | 33.637 |
| 1206.0 | 33.677 |
| 1205.0 | 34.202 |
| 1204.0 | 35.115 |
| 1203.0 | 36.221 |
| 1202.0 | 37.369 |
| 1201.0 | 38.282 |
| 1200.0 | 38.806 |
| 1199.0 | 38.86 |
| 1198.0 | 38.569 |
| 1197.0 | 38.168 |
| 1196.0 | 37.865 |
| 1195.0 | 37.851 |
| 1194.0 | 38.237 |
| 1193.0 | 39.017 |
| 1192.0 | 40.169 |
| 1191.0 | 41.444 |
| 1190.0 | 42.633 |
| 1189.0 | 43.595 |
| 1188.0 | 43.968 |
| 1187.0 | 43.782 |
| 1186.0 | 43.216 |
| 1185.0 | 42.505 |
| 1184.0 | 41.879 |
| 1183.0 | 41.467 |
| 1182.0 | 41.388 |
| 1181.0 | 41.591 |
| 1180.0 | 41.996 |
| 1179.0 | 42.399 |
| 1178.0 | 42.623 |
| 1177.0 | 42.533 |
| 1176.0 | 42.065 |
| 1175.0 | 41.335 |
| 1174.0 | 40.436 |
| 1173.0 | 39.56 |
| 1172.0 | 38.784 |
| 1171.0 | 38.229 |
| 1170.0 | 37.931 |
| 1169.0 | 37.831 |
| 1168.0 | 37.822 |
| 1167.0 | 37.815 |
| 1166.0 | 37.661 |
| 1165.0 | 37.307 |
| 1164.0 | 36.772 |
| 1163.0 | 36.149 |
| 1162.0 | 35.488 |
| 1161.0 | 35.011 |
| 1160.0 | 34.767 |
| 1159.0 | 34.743 |
| 1158.0 | 34.922 |
| 1157.0 | 35.207 |
| 1156.0 | 35.511 |
| 1155.0 | 35.722 |
| 1154.0 | 35.743 |
| 1153.0 | 35.651 |
| 1152.0 | 35.526 |
| 1151.0 | 35.449 |
| 1150.0 | 35.575 |
| 1149.0 | 35.952 |
| 1148.0 | 36.64 |
| 1147.0 | 37.542 |
| 1146.0 | 38.643 |
| 1145.0 | 39.732 |
| 1144.0 | 40.63 |
| 1143.0 | 41.36 |
| 1142.0 | 41.903 |
| 1141.0 | 42.348 |
| 1140.0 | 42.818 |
| 1139.0 | 43.414 |
| 1138.0 | 44.213 |
| 1137.0 | 45.193 |
| 1136.0 | 46.209 |
| 1135.0 | 47.139 |
| 1134.0 | 47.764 |
| 1133.0 | 47.87 |
| 1132.0 | 47.654 |
| 1131.0 | 47.299 |
| 1130.0 | 46.993 |
| 1129.0 | 46.916 |
| 1128.0 | 47.21 |
| 1127.0 | 47.893 |
| 1126.0 | 48.758 |
| 1125.0 | 49.502 |
| 1124.0 | 49.811 |
| 1123.0 | 49.357 |
| 1122.0 | 48.04 |
| 1121.0 | 46.194 |
| 1120.0 | 44.181 |
| 1119.0 | 42.483 |
| 1118.0 | 41.349 |
| 1117.0 | 40.855 |
| 1116.0 | 40.861 |
| 1115.0 | 41.002 |
| 1114.0 | 40.809 |
| 1113.0 | 39.935 |
| 1112.0 | 38.223 |
| 1111.0 | 35.951 |
| 1110.0 | 33.563 |
| 1109.0 | 31.58 |
| 1108.0 | 30.246 |
| 1107.0 | 29.78 |
| 1106.0 | 30.245 |
| 1105.0 | 31.557 |
| 1104.0 | 33.639 |
| 1103.0 | 35.99 |
| 1102.0 | 38.118 |
| 1101.0 | 39.184 |
| 1100.0 | 39.007 |
| 1099.0 | 37.75 |
| 1098.0 | 36.127 |
| 1097.0 | 34.679 |
| 1096.0 | 33.886 |
| 1095.0 | 33.992 |
| 1094.0 | 35.128 |
| 1093.0 | 37.162 |
| 1092.0 | 40.107 |
| 1091.0 | 43.137 |
| 1090.0 | 46.096 |
| 1089.0 | 48.042 |
| 1088.0 | 48.769 |
| 1087.0 | 48.441 |
| 1086.0 | 47.59 |
| 1085.0 | 46.99 |
| 1084.0 | 47.009 |
| 1083.0 | 47.858 |
| 1082.0 | 49.592 |
| 1081.0 | 51.838 |
| 1080.0 | 54.457 |
| 1079.0 | 56.985 |
| 1078.0 | 58.863 |
| 1077.0 | 60.089 |
| 1076.0 | 60.462 |
| 1075.0 | 60.005 |
| 1074.0 | 58.652 |
| 1073.0 | 56.795 |
| 1072.0 | 54.46 |
| 1071.0 | 52.419 |
| 1070.0 | 50.869 |
| 1069.0 | 50.216 |
| 1068.0 | 50.654 |
| 1067.0 | 52.091 |
| 1066.0 | 54.2 |
| 1065.0 | 56.044 |
| 1064.0 | 56.557 |
| 1063.0 | 55.037 |
| 1062.0 | 51.627 |
| 1061.0 | 47.592 |
| 1060.0 | 43.461 |
| 1059.0 | 41.048 |
| 1058.0 | 40.088 |
| 1057.0 | 40.931 |
| 1056.0 | 43.541 |
| 1055.0 | 47.364 |
| 1054.0 | 51.596 |
| 1053.0 | 54.433 |
| 1052.0 | 54.615 |
| 1051.0 | 52.201 |
| 1050.0 | 48.347 |
| 1049.0 | 44.766 |
| 1048.0 | 42.586 |
| 1047.0 | 42.542 |
| 1046.0 | 44.867 |
| 1045.0 | 49.625 |
| 1044.0 | 55.717 |
| 1043.0 | 62.027 |
| 1042.0 | 66.107 |
| 1041.0 | 66.563 |
| 1040.0 | 64.24 |
| 1039.0 | 61.376 |
| 1038.0 | 60.081 |
| 1037.0 | 61.271 |
| 1036.0 | 64.798 |
| 1035.0 | 69.118 |
| 1034.0 | 72.066 |
| 1033.0 | 71.21 |
| 1032.0 | 66.759 |
| 1031.0 | 60.789 |
| 1030.0 | 55.632 |
| 1029.0 | 53.09 |
| 1028.0 | 53.525 |
| 1027.0 | 56.711 |
| 1026.0 | 61.643 |
| 1025.0 | 65.094 |
| 1024.0 | 65.387 |
| 1023.0 | 61.641 |
| 1022.0 | 55.176 |
| 1021.0 | 49.43 |
| 1020.0 | 45.077 |
| 1019.0 | 43.354 |
| 1018.0 | 44.159 |
| 1017.0 | 47.136 |
| 1016.0 | 51.811 |
| 1015.0 | 56.51 |
| 1014.0 | 59.959 |
| 1013.0 | 60.64 |
| 1012.0 | 59.373 |
| 1011.0 | 57.375 |
| 1010.0 | 56.475 |
| 1009.0 | 57.478 |
| 1008.0 | 60.883 |
| 1007.0 | 66.117 |
| 1006.0 | 72.207 |
| 1005.0 | 77.256 |
| 1004.0 | 79.571 |
| 1003.0 | 79.375 |
| 1002.0 | 77.497 |
| 1001.0 | 75.577 |
| 1000.0 | 74.398 |
| 999.0 | 74.383 |
| 998.0 | 74.806 |
| 997.0 | 75.084 |
| 996.0 | 75.063 |
| 995.0 | 75.159 |
| 994.0 | 75.998 |
| 993.0 | 77.981 |
| 992.0 | 80.855 |
| 991.0 | 83.332 |
| 990.0 | 83.858 |
| 989.0 | 81.572 |
| 988.0 | 77.018 |
| 987.0 | 71.996 |
| 986.0 | 68.164 |
| 985.0 | 67.268 |
| 984.0 | 69.124 |
| 983.0 | 73.379 |
| 982.0 | 78.485 |
| 981.0 | 81.869 |
| 980.0 | 82.744 |
| 979.0 | 80.462 |
| 978.0 | 76.382 |
| 977.0 | 72.792 |
| 976.0 | 70.813 |
| 975.0 | 71.451 |
| 974.0 | 74.581 |
| 973.0 | 79.042 |
| 972.0 | 84.121 |
| 971.0 | 88.259 |
| 970.0 | 90.46 |
| 969.0 | 90.929 |
| 968.0 | 90.241 |
| 967.0 | 89.234 |
| 966.0 | 88.375 |
| 965.0 | 87.846 |
| 964.0 | 87.635 |
| 963.0 | 87.598 |
| 962.0 | 87.862 |
| 961.0 | 88.572 |
| 960.0 | 89.782 |
| 959.0 | 91.292 |
| 958.0 | 92.703 |
| 957.0 | 93.627 |
| 956.0 | 93.931 |
| 955.0 | 93.894 |
| 954.0 | 93.936 |
| 953.0 | 94.301 |
| 952.0 | 94.865 |
| 951.0 | 95.243 |
| 950.0 | 95.172 |
| 949.0 | 94.615 |
| 948.0 | 93.825 |
| 947.0 | 93.403 |
| 946.0 | 93.654 |
| 945.0 | 94.472 |
| 944.0 | 95.402 |
| 943.0 | 95.826 |
| 942.0 | 95.555 |
| 941.0 | 94.752 |
| 940.0 | 93.91 |
| 939.0 | 93.643 |
| 938.0 | 94.117 |
| 937.0 | 95.125 |
| 936.0 | 96.113 |
| 935.0 | 96.542 |
| 934.0 | 96.299 |
| 933.0 | 95.608 |
| 932.0 | 94.932 |
| 931.0 | 94.752 |
| 930.0 | 95.224 |
| 929.0 | 96.151 |
| 928.0 | 97.04 |
| 927.0 | 97.466 |
| 926.0 | 97.399 |
| 925.0 | 97.006 |
| 924.0 | 96.734 |
| 923.0 | 96.856 |
| 922.0 | 97.329 |
| 921.0 | 97.89 |
| 920.0 | 98.269 |
| 919.0 | 98.367 |
| 918.0 | 98.27 |
| 917.0 | 98.177 |
| 916.0 | 98.268 |
| 915.0 | 98.525 |
| 914.0 | 98.768 |
| 913.0 | 98.867 |
| 912.0 | 98.806 |
| 911.0 | 98.705 |
| 910.0 | 98.66 |
| 909.0 | 98.764 |
| 908.0 | 98.98 |
| 907.0 | 99.129 |
| 906.0 | 99.208 |
| 905.0 | 99.201 |
| 904.0 | 99.171 |
| 903.0 | 99.16 |
| 902.0 | 99.203 |
| 901.0 | 99.293 |
| 900.0 | 98.851 |
| 899.0 | 96.132 |
| 898.0 | 93.264 |
| 897.0 | 92.956 |
| 896.0 | 98.981 |
| 895.0 | 97.679 |
| 894.0 | 94.818 |
| 893.0 | 98.086 |
| 892.0 | 98.925 |
| 891.0 | 97.534 |
| 890.0 | 98.337 |
| 889.0 | 96.384 |
| 888.0 | 97.061 |
| 887.0 | 98.719 |
| 886.0 | 96.972 |
| 885.0 | 98.243 |
| 884.0 | 98.955 |
| 883.0 | 99.693 |
| 882.0 | 98.769 |
| 881.0 | 98.624 |
| 880.0 | 97.852 |
| 879.0 | 99.669 |
| 878.0 | 96.096 |
| 877.0 | 93.818 |
| 876.0 | 93.046 |
| 875.0 | 98.914 |
| 874.0 | 98.563 |
| 873.0 | 98.294 |
| 872.0 | 97.687 |
| 871.0 | 98.966 |
| 870.0 | 99.133 |
| 869.0 | 95.521 |
| 868.0 | 99.268 |
| 867.0 | 98.985 |
| 866.0 | 98.85 |
| 865.0 | 98.991 |
| 864.0 | 99.697 |
| 863.0 | 95.239 |
| 862.0 | 98.077 |
| 861.0 | 99.536 |
| 860.0 | 96.147 |
| 859.0 | 99.435 |
| 858.0 | 99.034 |
| 857.0 | 99.034 |
| 856.0 | 98.883 |
| 855.0 | 99.502 |
| 854.0 | 99.906 |
| 853.0 | 99.496 |
| 852.0 | 99.926 |
| 851.0 | 99.687 |
| 850.0 | 98.948 |
| 849.0 | 99.813 |
| 848.0 | 99.34 |
| 847.0 | 98.768 |
| 846.0 | 99.8 |
| 845.0 | 99.58 |
| 844.0 | 99.351 |
| 843.0 | 98.868 |
| 842.0 | 99.791 |
| 841.0 | 99.426 |
| 840.0 | 99.874 |
| 839.0 | 99.64 |
| 838.0 | 99.875 |
| 837.0 | 99.229 |
| 836.0 | 99.328 |
| 835.0 | 99.158 |
| 834.0 | 99.825 |
| 833.0 | 99.579 |
| 832.0 | 99.628 |
| 831.0 | 99.64 |
| 830.0 | 99.848 |
| 829.0 | 99.421 |
| 828.0 | 99.651 |
| 827.0 | 99.627 |
| 826.0 | 99.759 |
| 825.0 | 99.92 |
| 824.0 | 98.996 |
| 823.0 | 98.916 |
| 822.0 | 98.762 |
| 821.0 | 99.685 |
| 820.0 | 99.682 |
| 819.0 | 99.934 |
| 818.0 | 99.888 |
| 817.0 | 99.435 |
| 816.0 | 98.989 |
| 815.0 | 99.655 |
| 814.0 | 99.817 |
| 813.0 | 99.594 |
| 812.0 | 99.709 |
| 811.0 | 99.67 |
| 810.0 | 99.864 |
| 809.0 | 99.285 |
| 808.0 | 99.072 |
| 807.0 | 99.659 |
| 806.0 | 99.329 |
| 805.0 | 99.83 |
| 804.0 | 99.93 |
| 803.0 | 99.724 |
| 802.0 | 99.681 |
| 801.0 | 99.345 |
| 800.0 | 99.938 |
| 799.0 | 99.912 |
| 798.0 | 99.76 |
| 797.0 | 99.733 |
| 796.0 | 99.939 |
| 795.0 | 99.937 |
| 794.0 | 99.639 |
| 793.0 | 99.93 |
| 792.0 | 99.645 |
| 791.0 | 99.949 |
| 790.0 | 99.892 |
| 789.0 | 99.513 |
| 788.0 | 99.884 |
| 787.0 | 99.04 |
| 786.0 | 99.804 |
| 785.0 | 99.328 |
| 784.0 | 99.38 |
| 783.0 | 99.464 |
| 782.0 | 99.839 |
| 781.0 | 99.592 |
| 780.0 | 99.565 |
| 779.0 | 99.879 |
| 778.0 | 99.416 |
| 777.0 | 99.027 |
| 776.0 | 99.846 |
| 775.0 | 99.809 |
| 774.0 | 99.646 |
| 773.0 | 99.451 |
| 772.0 | 99.378 |
| 771.0 | 99.721 |
| 770.0 | 99.158 |
| 769.0 | 99.597 |
| 768.0 | 99.702 |
| 767.0 | 99.878 |
| 766.0 | 99.7 |
| 765.0 | 99.926 |
| 764.0 | 99.732 |
| 763.0 | 99.555 |
| 762.0 | 99.979 |
| 761.0 | 99.872 |
| 760.0 | 99.533 |
| 759.0 | 99.476 |
| 758.0 | 99.913 |
| 757.0 | 99.747 |
| 756.0 | 99.735 |
| 755.0 | 99.705 |
| 754.0 | 98.921 |
| 753.0 | 99.136 |
| 752.0 | 99.703 |
| 751.0 | 99.643 |
| 750.0 | 99.766 |
| 749.0 | 99.576 |
| 748.0 | 99.765 |
| 747.0 | 99.794 |
| 746.0 | 99.585 |
| 745.0 | 99.159 |
| 744.0 | 99.707 |
| 743.0 | 99.945 |
| 742.0 | 99.357 |
| 741.0 | 98.909 |
| 740.0 | 99.288 |
| 739.0 | 99.982 |
| 738.0 | 99.858 |
| 737.0 | 99.539 |
| 736.0 | 99.223 |
| 735.0 | 99.444 |
| 734.0 | 99.126 |
| 733.0 | 98.425 |
| 732.0 | 98.907 |
| 731.0 | 99.792 |
| 730.0 | 99.61 |
| 729.0 | 99.071 |
| 728.0 | 99.098 |
| 727.0 | 99.655 |
| 726.0 | 99.617 |
| 725.0 | 98.762 |
| 724.0 | 98.85 |
| 723.0 | 99.602 |
| 722.0 | 99.701 |
| 721.0 | 99.079 |
| 720.0 | 98.989 |
| 719.0 | 99.478 |
| 718.0 | 99.677 |
| 717.0 | 99.383 |
| 716.0 | 99.146 |
| 715.0 | 99.302 |
| 714.0 | 99.423 |
| 713.0 | 99.006 |
| 712.0 | 98.866 |
| 711.0 | 99.705 |
| 710.0 | 99.764 |
| 709.0 | 99.129 |
| 708.0 | 99.148 |
| 707.0 | 99.479 |
| 706.0 | 99.117 |
| 705.0 | 98.49 |
| 704.0 | 98.824 |
| 703.0 | 99.291 |
| 702.0 | 99.032 |
| 701.0 | 98.508 |
| 700.0 | 98.723 |
| 699.0 | 99.51 |
| 698.0 | 99.255 |
| 697.0 | 98.641 |
| 696.0 | 99.109 |
| 695.0 | 99.137 |
| 694.0 | 98.386 |
| 693.0 | 98.316 |
| 692.0 | 99.049 |
| 691.0 | 99.001 |
| 690.0 | 97.995 |
| 689.0 | 98.369 |
| 688.0 | 99.514 |
| 687.0 | 99.32 |
| 686.0 | 98.721 |
| 685.0 | 98.99 |
| 684.0 | 99.243 |
| 683.0 | 98.652 |
| 682.0 | 98.451 |
| 681.0 | 99.02 |
| 680.0 | 98.679 |
| 679.0 | 98.077 |
| 678.0 | 98.923 |
| 677.0 | 99.313 |
| 676.0 | 98.21 |
| 675.0 | 98.478 |
| 674.0 | 99.523 |
| 673.0 | 98.823 |
| 672.0 | 98.227 |
| 671.0 | 99.555 |
| 670.0 | 99.327 |
| 669.0 | 98.032 |
| 668.0 | 98.884 |
| 667.0 | 98.837 |
| 666.0 | 97.453 |
| 665.0 | 98.068 |
| 664.0 | 98.762 |
| 663.0 | 97.919 |
| 662.0 | 97.466 |
| 661.0 | 98.568 |
| 660.0 | 97.876 |
| 659.0 | 96.79 |
| 658.0 | 98.397 |
| 657.0 | 97.796 |
| 656.0 | 96.206 |
| 655.0 | 98.063 |
| 654.0 | 98.262 |
| 653.0 | 96.54 |
| 652.0 | 97.726 |
| 651.0 | 98.879 |
| 650.0 | 98.673 |
| 649.0 | 99.235 |
| 648.0 | 99.037 |
| 647.0 | 99.343 |
| 646.0 | 99.107 |
| 645.0 | 98.536 |
| 644.0 | 97.11 |
| 643.0 | 94.145 |
| 642.0 | 81.812 |
| 641.0 | 39.13 |
| 640.0 | 7.082 |
| 639.0 | 0.145 |
| 638.0 | 0.02 |
| 637.0 | 0.004 |
| 636.0 | 0 |
| 635.0 | 0 |
| 634.0 | 0 |
| 633.0 | 0 |
| 632.0 | 0 |
| 631.0 | 0 |
| 630.0 | 0 |
| 629.0 | 0 |
| 628.0 | 0 |
| 627.0 | 0 |
| 626.0 | 0.002 |
| 625.0 | 0.011 |
| 624.0 | 0.083 |
| 623.0 | 1.674 |
| 622.0 | 23.645 |
| 621.0 | 73.55 |
| 620.0 | 94.552 |
| 619.0 | 97.541 |
| 618.0 | 97.983 |
| 617.0 | 98.551 |
| 616.0 | 98.544 |
| 615.0 | 98.268 |
| 614.0 | 98.577 |
| 613.0 | 97.841 |
| 612.0 | 95.891 |
| 611.0 | 97.466 |
| 610.0 | 97.681 |
| 609.0 | 96.59 |
| 608.0 | 97.89 |
| 607.0 | 97.222 |
| 606.0 | 97.517 |
| 605.0 | 97.287 |
| 604.0 | 96.679 |
| 603.0 | 97.852 |
| 602.0 | 97.731 |
| 601.0 | 97.586 |
| 600.0 | 98.25 |
| 599.0 | 97.615 |
| 598.0 | 98.709 |
| 597.0 | 97.621 |
| 596.0 | 97.923 |
| 595.0 | 97.855 |
| 594.0 | 96.907 |
| 593.0 | 98.13 |
| 592.0 | 98.251 |
| 591.0 | 97.935 |
| 590.0 | 98.315 |
| 589.0 | 97.226 |
| 588.0 | 98.241 |
| 587.0 | 98.419 |
| 586.0 | 98.058 |
| 585.0 | 98.067 |
| 584.0 | 97.743 |
| 583.0 | 98.052 |
| 582.0 | 97.703 |
| 581.0 | 97.63 |
| 580.0 | 98.211 |
| 579.0 | 98.124 |
| 578.0 | 98.425 |
| 577.0 | 98.26 |
| 576.0 | 97.823 |
| 575.0 | 97.944 |
| 574.0 | 97.785 |
| 573.0 | 98.269 |
| 572.0 | 98.085 |
| 571.0 | 98.541 |
| 570.0 | 97.712 |
| 569.0 | 97.934 |
| 568.0 | 98.032 |
| 567.0 | 97.675 |
| 566.0 | 98.343 |
| 565.0 | 98.126 |
| 564.0 | 98.667 |
| 563.0 | 98.43 |
| 562.0 | 98.473 |
| 561.0 | 97.689 |
| 560.0 | 97.545 |
| 559.0 | 98.545 |
| 558.0 | 97.93 |
| 557.0 | 98.418 |
| 556.0 | 98.695 |
| 555.0 | 97.869 |
| 554.0 | 97.874 |
| 553.0 | 98.69 |
| 552.0 | 97.942 |
| 551.0 | 98.311 |
| 550.0 | 97.573 |
| 549.0 | 98.435 |
| 548.0 | 98.59 |
| 547.0 | 98.081 |
| 546.0 | 99.076 |
| 545.0 | 98.745 |
| 544.0 | 98.296 |
| 543.0 | 98.63 |
| 542.0 | 98.241 |
| 541.0 | 98.045 |
| 540.0 | 98.495 |
| 539.0 | 99.016 |
| 538.0 | 99.088 |
| 537.0 | 98.495 |
| 536.0 | 98.705 |
| 535.0 | 98.709 |
| 534.0 | 98.211 |
| 533.0 | 98.469 |
| 532.0 | 98.858 |
| 531.0 | 99.174 |
| 530.0 | 98.845 |
| 529.0 | 98.225 |
| 528.0 | 98.505 |
| 527.0 | 99.29 |
| 526.0 | 98.07 |
| 525.0 | 97.818 |
| 524.0 | 98.216 |
| 523.0 | 98.404 |
| 522.0 | 98.94 |
| 521.0 | 99.086 |
| 520.0 | 98.638 |
| 519.0 | 98.092 |
| 518.0 | 97.92 |
| 517.0 | 97.791 |
| 516.0 | 98.923 |
| 515.0 | 97.661 |
| 514.0 | 98.647 |
| 513.0 | 98.373 |
| 512.0 | 97.694 |
| 511.0 | 97.776 |
| 510.0 | 97.681 |
| 509.0 | 98.138 |
| 508.0 | 98.647 |
| 507.0 | 98.017 |
| 506.0 | 97.684 |
| 505.0 | 98.032 |
| 504.0 | 97.604 |
| 503.0 | 97.375 |
| 502.0 | 98.046 |
| 501.0 | 98.158 |
| 500.0 | 98.426 |
| 499.0 | 98.088 |
| 498.0 | 97.588 |
| 497.0 | 97.805 |
| 496.0 | 97.941 |
| 495.0 | 97.84 |
| 494.0 | 97.856 |
| 493.0 | 98.065 |
| 492.0 | 98.268 |
| 491.0 | 98.15 |
| 490.0 | 98.508 |
| 489.0 | 98.329 |
| 488.0 | 98.255 |
| 487.0 | 98.389 |
| 486.0 | 98.336 |
| 485.0 | 97.294 |
| 484.0 | 97.952 |
| 483.0 | 98.668 |
| 482.0 | 97.541 |
| 481.0 | 98.726 |
| 480.0 | 98.373 |
| 479.0 | 98.996 |
| 478.0 | 98.583 |
| 477.0 | 98.273 |
| 476.0 | 98.742 |
| 475.0 | 98.926 |
| 474.0 | 98.624 |
| 473.0 | 98.555 |
| 472.0 | 98.503 |
| 471.0 | 98.411 |
| 470.0 | 98.326 |
| 469.0 | 98.167 |
| 468.0 | 98.06 |
| 467.0 | 98.029 |
| 466.0 | 97.533 |
| 465.0 | 95.579 |
| 464.0 | 91.316 |
| 463.0 | 85.355 |
| 462.0 | 79.41 |
| 461.0 | 74.718 |
| 460.0 | 71.175 |
| 459.0 | 67.168 |
| 458.0 | 61.41 |
| 457.0 | 54.579 |
| 456.0 | 48.046 |
| 455.0 | 42.22 |
| 454.0 | 36.655 |
| 453.0 | 30.536 |
| 452.0 | 23.853 |
| 451.0 | 17.892 |
| 450.0 | 13.315 |
| 449.0 | 9.6 |
| 448.0 | 6.451 |
| 447.0 | 4.206 |
| 446.0 | 2.883 |
| 445.0 | 1.946 |
| 444.0 | 1.185 |
| 443.0 | 0.709 |
| 442.0 | 0.42 |
| 441.0 | 0.194 |
| 440.0 | 0.052 |
| 439.0 | 0.005 |
| 438.0 | 0.004 |
| 437.0 | 0.003 |
| 436.0 | 0.001 |
| 435.0 | 0.003 |
| 434.0 | 0.004 |
| 433.0 | 0.003 |
| 432.0 | 0.005 |
| 431.0 | 0.003 |
| 430.0 | 0.001 |
| 429.0 | 0.002 |
| 428.0 | 0.005 |
| 427.0 | 0.004 |
| 426.0 | 0.005 |
| 425.0 | 0.002 |
| 424.0 | 0.001 |
| 423.0 | 0.003 |
| 422.0 | 0.004 |
| 421.0 | 0.003 |
| 420.0 | 0.005 |
| 419.0 | 0.002 |
| 418.0 | 0.001 |
| 417.0 | 0.002 |
| 416.0 | 0.005 |
| 415.0 | 0.003 |
| 414.0 | 0.004 |
| 413.0 | 0.002 |
| 412.0 | 0.001 |
| 411.0 | 0.004 |
| 410.0 | 0.006 |
| 409.0 | 0.006 |
| 408.0 | 0.005 |
| 407.0 | 0.003 |
| 406.0 | 0.005 |
| 405.0 | 0.005 |
| 404.0 | 0.005 |
| 403.0 | 0.003 |
| 402.0 | 0.004 |
| 401.0 | 0.002 |
| 400.0 | 0.001 |
| 399.0 | 0.002 |
| 398.0 | 0.005 |
| 397.0 | 0.005 |
| 396.0 | 0.005 |
| 395.0 | 0.004 |
| 394.0 | 0.001 |
| 393.0 | 0.003 |
| 392.0 | 0.006 |
| 391.0 | 0.003 |
| 390.0 | 0.004 |
| 389.0 | 0.003 |
| 388.0 | 0.002 |
| 387.0 | 0.003 |
| 386.0 | 0.004 |
| 385.0 | 0.004 |
| 384.0 | 0.005 |
| 383.0 | 0.003 |
| 382.0 | 0.001 |
| 381.0 | 0.004 |
| 380.0 | 0.005 |
| 379.0 | 0.005 |
| 378.0 | 0.006 |
| 377.0 | 0.003 |
| 376.0 | 0.004 |
| 375.0 | 0.001 |
| 374.0 | 0.003 |
| 373.0 | 0.002 |
| 372.0 | 0.001 |
| 371.0 | 0.003 |
| 370.0 | 0.005 |
| 369.0 | 0.005 |
| 368.0 | 0.004 |
| 367.0 | 0.001 |
| 366.0 | 0 |
| 365.0 | 0.003 |
| 364.0 | 0.004 |
| 363.0 | 0.002 |
| 362.0 | 0.004 |
| 361.0 | 0.002 |
| 360.0 | 0.001 |
| 359.0 | 0.003 |
| 358.0 | 0.005 |
| 357.0 | 0.005 |
| 356.0 | 0.004 |
| 355.0 | 0.002 |
| 354.0 | 0 |
| 353.0 | 0.004 |
| 352.0 | 0.004 |
| 351.0 | 0.003 |
| 350.0 | 0.004 |
| 349.0 | 0.003 |
| 348.0 | 0.001 |
| 347.0 | 0.005 |
| 346.0 | 0.004 |
| 345.0 | 0.003 |
| 344.0 | 0.004 |
| 343.0 | 0.003 |
| 342.0 | 0 |
| 341.0 | 0.005 |
| 340.0 | 0.005 |
| 339.0 | 0.004 |
| 338.0 | 0.004 |
| 337.0 | 0.003 |
| 336.0 | 0 |
| 335.0 | 0.005 |
| 334.0 | 0.006 |
| 333.0 | 0.003 |
| 332.0 | 0.004 |
| 331.0 | 0.003 |
| 330.0 | 0.001 |
| 329.0 | 0.005 |
| 328.0 | 0.006 |
| 327.0 | 0.006 |
| 326.0 | 0.004 |
| 325.0 | 0.002 |
| 324.0 | 0 |
| 323.0 | 0.005 |
| 322.0 | 0.006 |
| 321.0 | 0.006 |
| 320.0 | 0.005 |
| 319.0 | 0 |
| 318.0 | 0.005 |
| 317.0 | 0.005 |
| 316.0 | 0.006 |
| 315.0 | 0.001 |
| 314.0 | 0.003 |
| 313.0 | 0 |
| 312.0 | 0.001 |
| 311.0 | 0.004 |
| 310.0 | 0.005 |
| 309.0 | 0.001 |
| 308.0 | 0.005 |
| 307.0 | 0.001 |
| 306.0 | 0 |
| 305.0 | 0.004 |
| 304.0 | 0.004 |
| 303.0 | 0.002 |
| 302.0 | 0.003 |
| 301.0 | 0.001 |
| 300.0 | 0 |
| 299.0 | 0.005 |
| 298.0 | 0.005 |
| 297.0 | 0.002 |
| 296.0 | 0.004 |
| 295.0 | 0.002 |
| 294.0 | 0 |
| 293.0 | 0.006 |
| 292.0 | 0.005 |
| 291.0 | 0.005 |
| 290.0 | 0.004 |
| 289.0 | 0.003 |
| 288.0 | 0 |
| 287.0 | 0.006 |
| 286.0 | 0.005 |
| 285.0 | 0.003 |
| 284.0 | 0.004 |
| 283.0 | 0.001 |
| 282.0 | 0.001 |
| 281.0 | 0.006 |
| 280.0 | 0.005 |
| 279.0 | 0.005 |
| 278.0 | 0.004 |
| 277.0 | 0 |
| 276.0 | 0 |
| 275.0 | 0.005 |
| 274.0 | 0.005 |
| 273.0 | 0.002 |
| 272.0 | 0.005 |
| 271.0 | 0 |
| 270.0 | 0.001 |
| 269.0 | 0.004 |
| 268.0 | 0.006 |
| 267.0 | 0.003 |
| 266.0 | 0.001 |
| 265.0 | 0 |
| 264.0 | 0.002 |
| 263.0 | 0.006 |
| 262.0 | 0.006 |
| 261.0 | 0.005 |
| 260.0 | 0.006 |
| 259.0 | 0.001 |
| 258.0 | 0.003 |
| 257.0 | 0.005 |
| 256.0 | 0.005 |
| 255.0 | 0.003 |
| 254.0 | 0.005 |
| 253.0 | 0 |
| 252.0 | 0.002 |
| 251.0 | 0.004 |
| 250.0 | 0.006 |
| 249.0 | 0.001 |
| 248.0 | 0.006 |
| 247.0 | 0.001 |
| 246.0 | 0.002 |
| 245.0 | 0.004 |
| 244.0 | 0.007 |
| 243.0 | 0.002 |
| 242.0 | 0.005 |
| 241.0 | 0.003 |
| 240.0 | 0.003 |
| 239.0 | 0.004 |
| 238.0 | 0.007 |
| 237.0 | 0.004 |
| 236.0 | 0.006 |
| 235.0 | 0.001 |
| 234.0 | 0.002 |
| 233.0 | 0.007 |
| 232.0 | 0.006 |
| 231.0 | 0.003 |
| 230.0 | 0.006 |
| 229.0 | 0.001 |
| 228.0 | 0.001 |
| 227.0 | 0.005 |
| 226.0 | 0.006 |
| 225.0 | 0.005 |
| 224.0 | 0.005 |
| 223.0 | 0.002 |
| 222.0 | 0.002 |
| 221.0 | 0.006 |
| 220.0 | 0.007 |
| 219.0 | 0.003 |
| 218.0 | 0.005 |
| 217.0 | 0.002 |
| 216.0 | 0.001 |
| 215.0 | 0.007 |
| 214.0 | 0.006 |
| 213.0 | 0.004 |
| 212.0 | 0.005 |
| 211.0 | 0.003 |
| 210.0 | 0.003 |
| 209.0 | 0.007 |
| 208.0 | 0.006 |
| 207.0 | 0.004 |
| 206.0 | 0.006 |
| 205.0 | 0.004 |
| 204.0 | 0.003 |
| 203.0 | 0.008 |
| 202.0 | 0.008 |
| 201.0 | 0.007 |